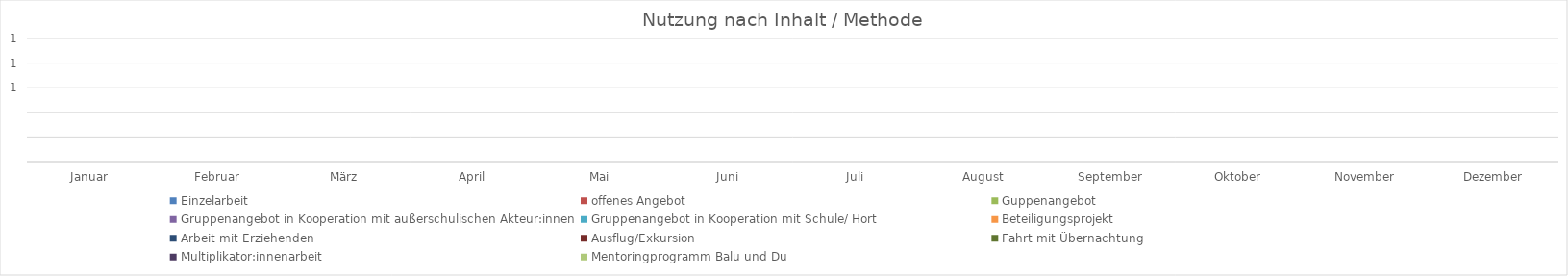
| Category | Einzelarbeit | offenes Angebot | Guppenangebot | Gruppenangebot in Kooperation mit außerschulischen Akteur:innen | Gruppenangebot in Kooperation mit Schule/ Hort | Beteiligungsprojekt | Arbeit mit Erziehenden | Ausflug/Exkursion | Fahrt mit Übernachtung | Multiplikator:innenarbeit | Mentoringprogramm Balu und Du |
|---|---|---|---|---|---|---|---|---|---|---|---|
| Januar | 0 | 0 | 0 | 0 | 0 | 0 | 0 | 0 | 0 | 0 | 0 |
| Februar | 0 | 0 | 0 | 0 | 0 | 0 | 0 | 0 | 0 | 0 | 0 |
| März | 0 | 0 | 0 | 0 | 0 | 0 | 0 | 0 | 0 | 0 | 0 |
| April | 0 | 0 | 0 | 0 | 0 | 0 | 0 | 0 | 0 | 0 | 0 |
| Mai | 0 | 0 | 0 | 0 | 0 | 0 | 0 | 0 | 0 | 0 | 0 |
| Juni | 0 | 0 | 0 | 0 | 0 | 0 | 0 | 0 | 0 | 0 | 0 |
| Juli | 0 | 0 | 0 | 0 | 0 | 0 | 0 | 0 | 0 | 0 | 0 |
| August | 0 | 0 | 0 | 0 | 0 | 0 | 0 | 0 | 0 | 0 | 0 |
| September | 0 | 0 | 0 | 0 | 0 | 0 | 0 | 0 | 0 | 0 | 0 |
| Oktober | 0 | 0 | 0 | 0 | 0 | 0 | 0 | 0 | 0 | 0 | 0 |
| November | 0 | 0 | 0 | 0 | 0 | 0 | 0 | 0 | 0 | 0 | 0 |
| Dezember | 0 | 0 | 0 | 0 | 0 | 0 | 0 | 0 | 0 | 0 | 0 |